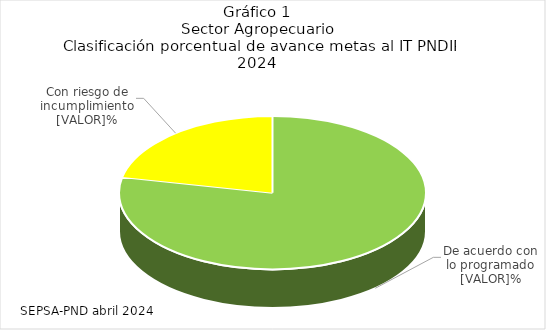
| Category | Series 0 |
|---|---|
| Cumplimiento Alto | 78.261 |
| Cumplimiento medio | 21.739 |